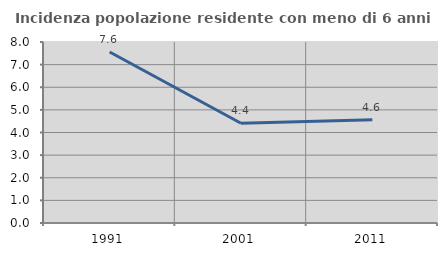
| Category | Incidenza popolazione residente con meno di 6 anni |
|---|---|
| 1991.0 | 7.559 |
| 2001.0 | 4.411 |
| 2011.0 | 4.567 |